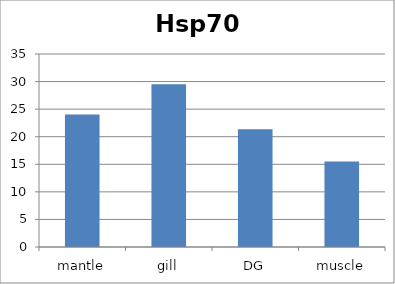
| Category | Series 0 |
|---|---|
| mantle | 24.034 |
| gill | 29.497 |
| DG | 21.347 |
| muscle | 15.492 |